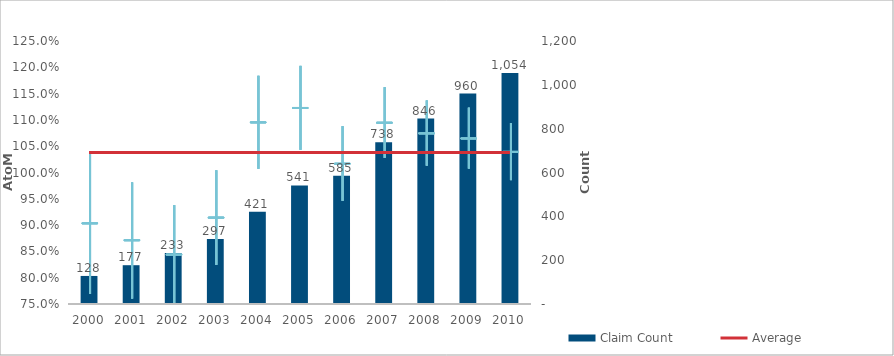
| Category | Claim Count |
|---|---|
| 0 | 128 |
| 1 | 177 |
| 2 | 233 |
| 3 | 297 |
| 4 | 421 |
| 5 | 541 |
| 6 | 585 |
| 7 | 738 |
| 8 | 846 |
| 9 | 960 |
| 10 | 1054 |